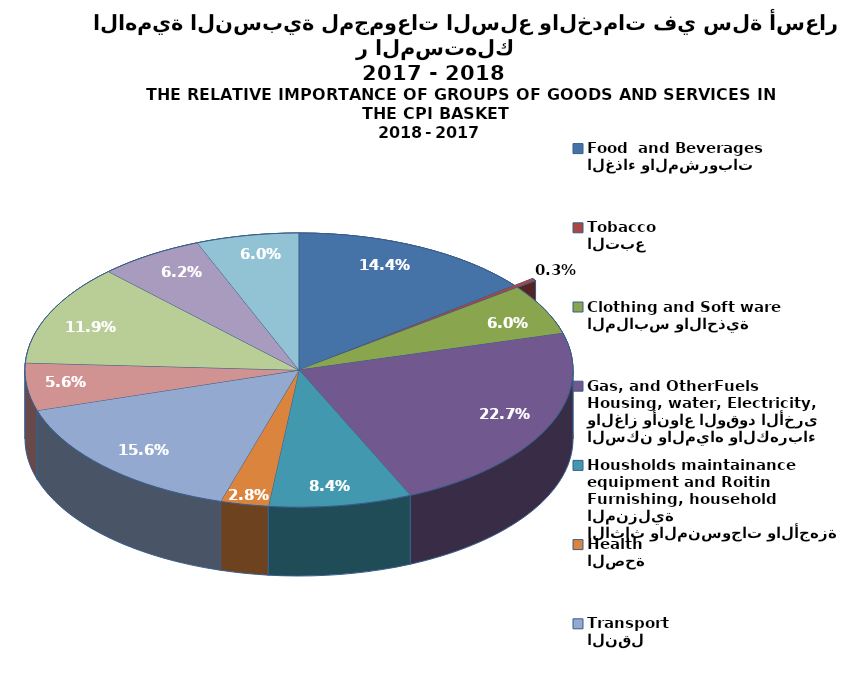
| Category | Series 0 |
|---|---|
| الغذاء والمشروبات
Food  and Beverages | 1345 |
| التبع
Tobacco | 28 |
| الملابس والاحذية
Clothing and Soft ware | 558 |
| السكن والمياه والكهرباء والغاز وأنواع الوقود الأخرى
Housing, water, Electricity, Gas, and OtherFuels | 2117 |
| الاثاث والمنسوجات والأجهزة المنزلية
Furnishing, household equipment and Roitin Housholds maintainance | 788 |
| الصحة
Health | 265 |
| النقل
Transport | 1459 |
| الاتصالات
Communication | 523 |
| التسلية والثقافة
Recreation and Culture services | 1113 |
| التعليم
Education | 578 |
| السلع والخدمات المتفرقة
Miscellaneous Gooda and Services | 565 |